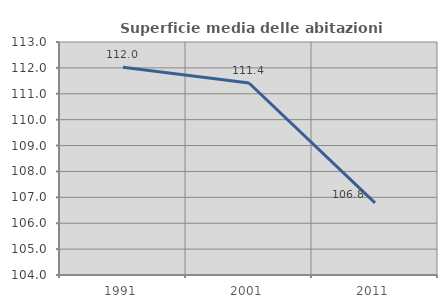
| Category | Superficie media delle abitazioni occupate |
|---|---|
| 1991.0 | 112.027 |
| 2001.0 | 111.416 |
| 2011.0 | 106.784 |